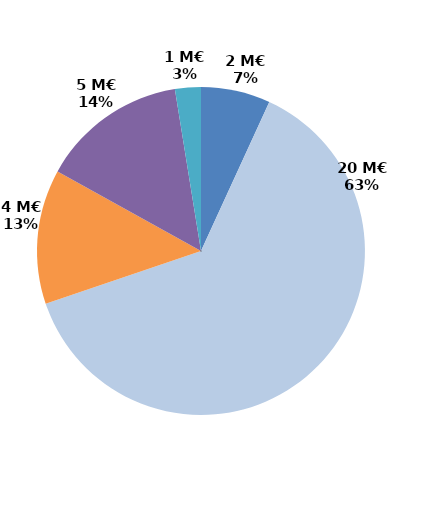
| Category | Series 0 |
|---|---|
| Contrats aidés marchand (hors IAE) | 2.169 |
| Contrats aidés non marchand (hors IAE) | 19.969 |
| Insertion par l'activité économique | 4.204 |
| Mesures en faveur des handicapés | 4.567 |
| Autres emplois aidés | 0.808 |